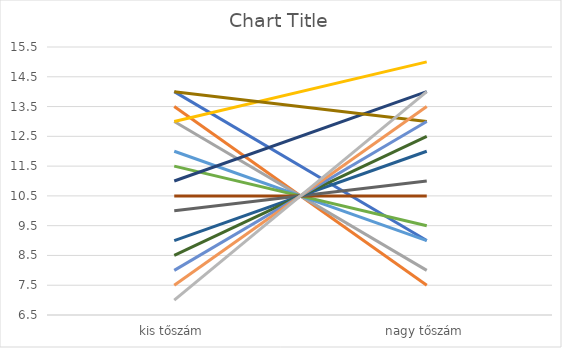
| Category | h1 | h2 | h3 | h4 | h5 | h6 | h7 | h8 | h9 | h10 | h11 | h12 | h13 | h14 | h15 |
|---|---|---|---|---|---|---|---|---|---|---|---|---|---|---|---|
| kis tőszám | 14 | 13.5 | 13 | 13 | 12 | 11.5 | 11 | 10.5 | 10 | 14 | 9 | 8.5 | 8 | 7.5 | 7 |
| nagy tőszám | 9 | 7.5 | 8 | 15 | 9 | 9.5 | 14 | 10.5 | 11 | 13 | 12 | 12.5 | 13 | 13.5 | 14 |